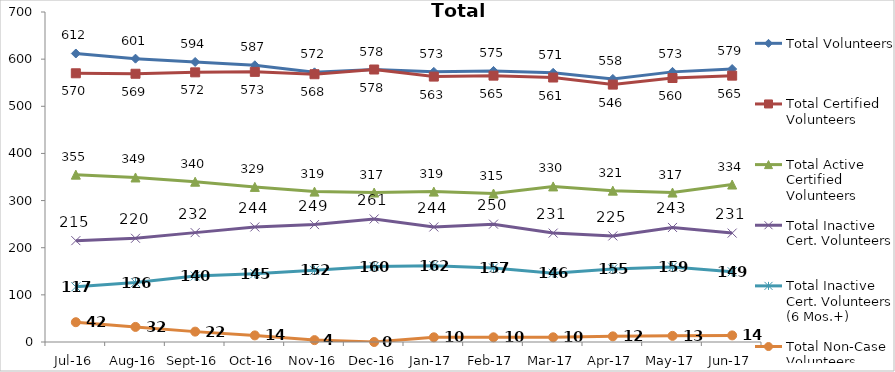
| Category | Total Volunteers | Total Certified Volunteers | Total Active Certified Volunteers | Total Inactive Cert. Volunteers | Total Inactive Cert. Volunteers (6 Mos.+) | Total Non-Case Volunteers |
|---|---|---|---|---|---|---|
| Jul-16 | 612 | 570 | 355 | 215 | 117 | 42 |
| Aug-16 | 601 | 569 | 349 | 220 | 126 | 32 |
| Sep-16 | 594 | 572 | 340 | 232 | 140 | 22 |
| Oct-16 | 587 | 573 | 329 | 244 | 145 | 14 |
| Nov-16 | 572 | 568 | 319 | 249 | 152 | 4 |
| Dec-16 | 578 | 578 | 317 | 261 | 160 | 0 |
| Jan-17 | 573 | 563 | 319 | 244 | 162 | 10 |
| Feb-17 | 575 | 565 | 315 | 250 | 157 | 10 |
| Mar-17 | 571 | 561 | 330 | 231 | 146 | 10 |
| Apr-17 | 558 | 546 | 321 | 225 | 155 | 12 |
| May-17 | 573 | 560 | 317 | 243 | 159 | 13 |
| Jun-17 | 579 | 565 | 334 | 231 | 149 | 14 |